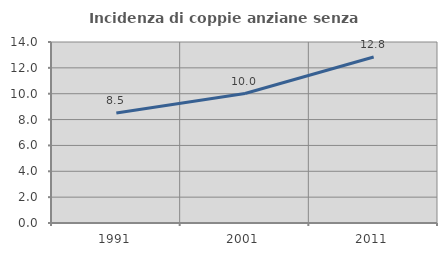
| Category | Incidenza di coppie anziane senza figli  |
|---|---|
| 1991.0 | 8.507 |
| 2001.0 | 10.015 |
| 2011.0 | 12.841 |